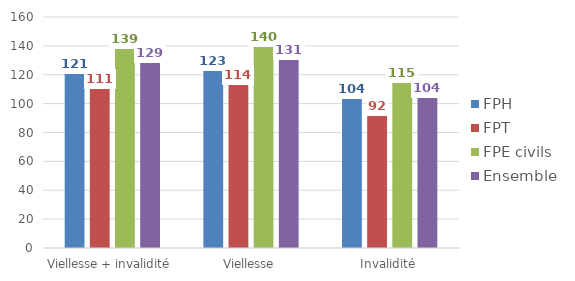
| Category | FPH | FPT | FPE civils | Ensemble |
|---|---|---|---|---|
| Viellesse + invalidité | 121.329 | 111.105 | 138.528 | 128.576 |
| Viellesse | 123.056 | 113.687 | 140.083 | 130.698 |
| Invalidité | 104.029 | 91.807 | 114.831 | 104.44 |